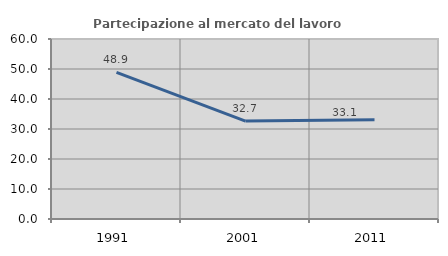
| Category | Partecipazione al mercato del lavoro  femminile |
|---|---|
| 1991.0 | 48.863 |
| 2001.0 | 32.655 |
| 2011.0 | 33.052 |